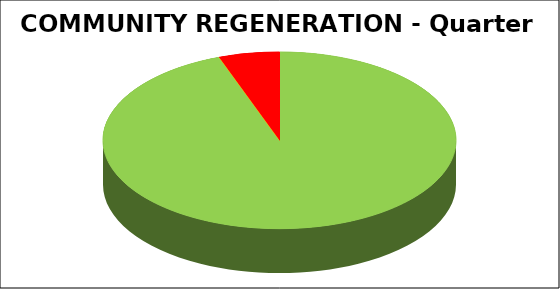
| Category | Series 0 |
|---|---|
| Green | 0.944 |
| Amber | 0 |
| Red | 0.056 |